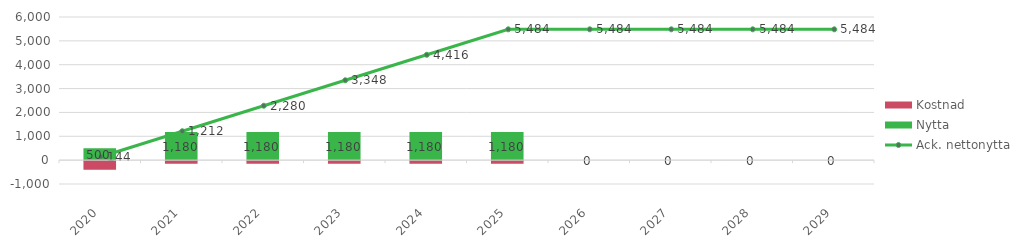
| Category | Nytta | Kostnad |
|---|---|---|
| 2020.0 | 500 | -356 |
| 2021.0 | 1180 | -112 |
| 2022.0 | 1180 | -112 |
| 2023.0 | 1180 | -112 |
| 2024.0 | 1180 | -112 |
| 2025.0 | 1180 | -112 |
| 2026.0 | 0 | 0 |
| 2027.0 | 0 | 0 |
| 2028.0 | 0 | 0 |
| 2029.0 | 0 | 0 |